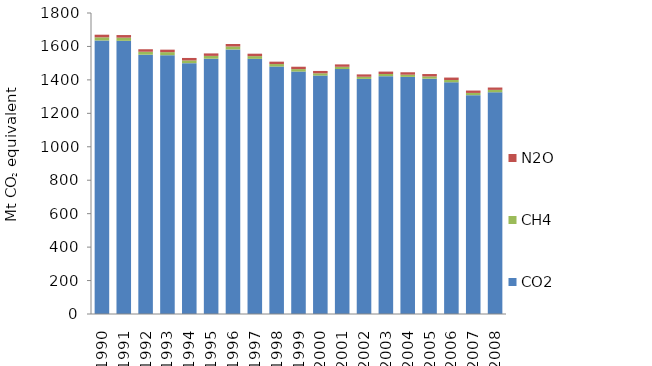
| Category | CO2 | CH4 | N2O |
|---|---|---|---|
| 1990 | 1635.673 | 18.938 | 15.616 |
| 1991 | 1633.653 | 18.999 | 15.446 |
| 1992 | 1550.567 | 17.817 | 14.926 |
| 1993 | 1547.675 | 18.303 | 14.87 |
| 1994 | 1500.051 | 16.488 | 14.583 |
| 1995 | 1526.617 | 16.907 | 14.784 |
| 1996 | 1582.058 | 17.603 | 14.958 |
| 1997 | 1525.886 | 16.108 | 14.691 |
| 1998 | 1479.68 | 15.012 | 14.309 |
| 1999 | 1449.799 | 14.739 | 14.185 |
| 2000 | 1425.739 | 13.635 | 14.055 |
| 2001 | 1464.719 | 13.658 | 14.274 |
| 2002 | 1405.981 | 12.889 | 13.99 |
| 2003 | 1422.195 | 13.174 | 14.266 |
| 2004 | 1417.91 | 13.265 | 14.424 |
| 2005 | 1407.139 | 13.43 | 14.471 |
| 2006 | 1385.765 | 13.656 | 14.505 |
| 2007 | 1308.663 | 13.419 | 14.182 |
| 2008 | 1326.007 | 14.23 | 14.131 |